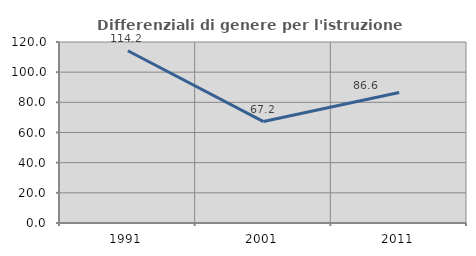
| Category | Differenziali di genere per l'istruzione superiore |
|---|---|
| 1991.0 | 114.208 |
| 2001.0 | 67.238 |
| 2011.0 | 86.561 |